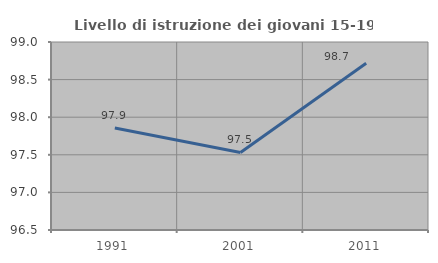
| Category | Livello di istruzione dei giovani 15-19 anni |
|---|---|
| 1991.0 | 97.857 |
| 2001.0 | 97.531 |
| 2011.0 | 98.718 |